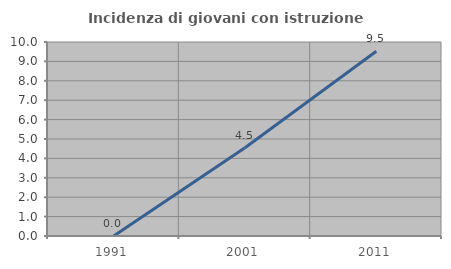
| Category | Incidenza di giovani con istruzione universitaria |
|---|---|
| 1991.0 | 0 |
| 2001.0 | 4.545 |
| 2011.0 | 9.524 |